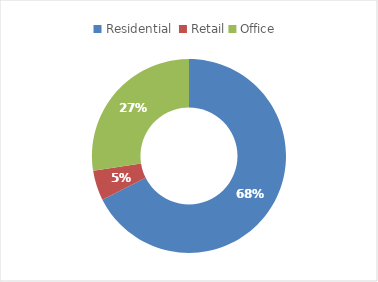
| Category | Series 0 |
|---|---|
| Residential  | 200765 |
| Retail | 14822 |
| Office | 81535 |